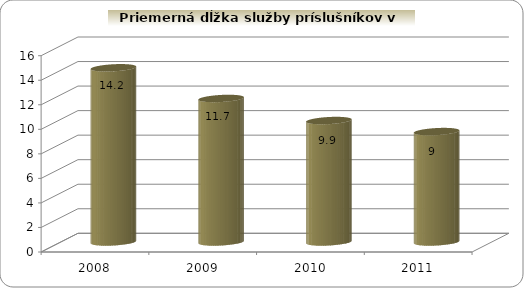
| Category | Priemerná dĺžka služby príslušníkov v rokoch |
|---|---|
| 2008.0 | 14.2 |
| 2009.0 | 11.7 |
| 2010.0 | 9.9 |
| 2011.0 | 9 |